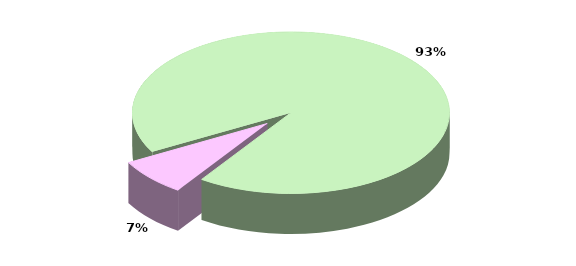
| Category | Series 0 |
|---|---|
| TOTALE ENTRATE CORRENTI | 22743.88 |
| TOTALE ENTRATE IN CONTO CAPITALE | 1824.549 |